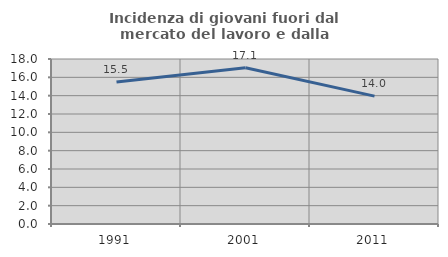
| Category | Incidenza di giovani fuori dal mercato del lavoro e dalla formazione  |
|---|---|
| 1991.0 | 15.482 |
| 2001.0 | 17.055 |
| 2011.0 | 13.952 |